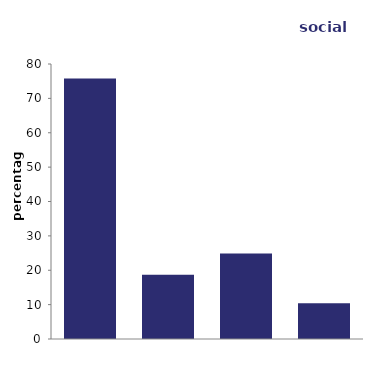
| Category | social rented |
|---|---|
| accepted as homeless | 75.782 |
| in priority need | 18.688 |
| offered accommodation | 24.839 |
| none | 10.388 |